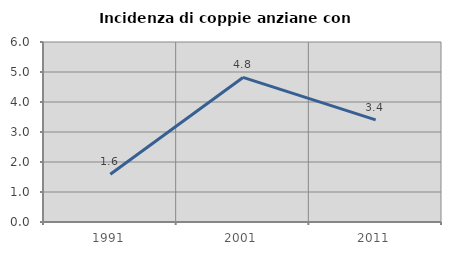
| Category | Incidenza di coppie anziane con figli |
|---|---|
| 1991.0 | 1.594 |
| 2001.0 | 4.819 |
| 2011.0 | 3.404 |